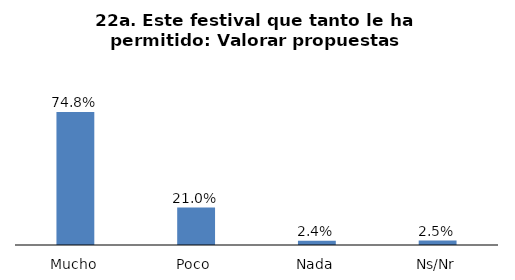
| Category | Series 0 |
|---|---|
| Mucho | 0.748 |
| Poco  | 0.21 |
| Nada | 0.024 |
| Ns/Nr | 0.025 |